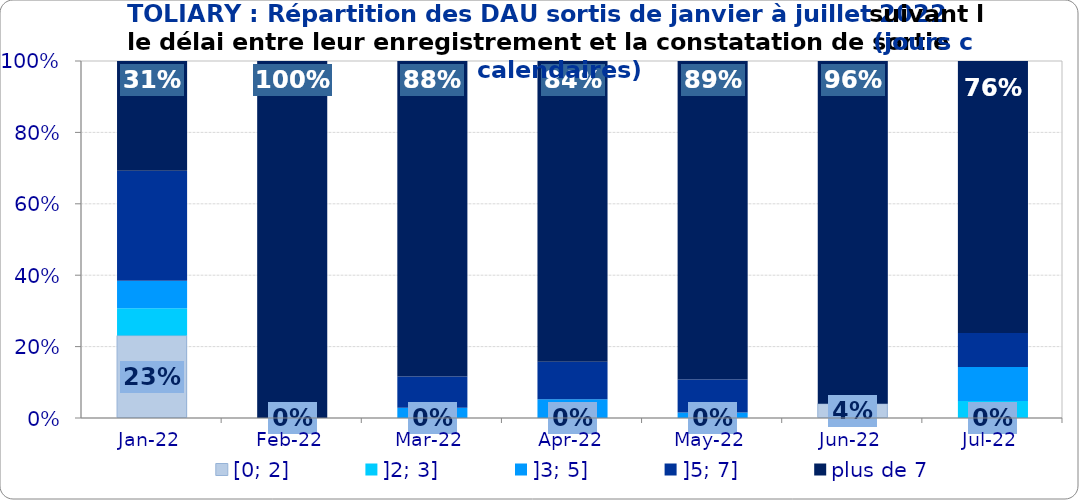
| Category | [0; 2] | ]2; 3] | ]3; 5] | ]5; 7] | plus de 7 |
|---|---|---|---|---|---|
| 2022-01-01 | 0.231 | 0.077 | 0.077 | 0.308 | 0.308 |
| 2022-02-01 | 0 | 0 | 0 | 0 | 1 |
| 2022-03-01 | 0 | 0 | 0.029 | 0.087 | 0.884 |
| 2022-04-01 | 0 | 0 | 0.053 | 0.105 | 0.842 |
| 2022-05-01 | 0 | 0 | 0.015 | 0.092 | 0.892 |
| 2022-06-01 | 0.04 | 0 | 0 | 0 | 0.96 |
| 2022-07-01 | 0 | 0.048 | 0.095 | 0.095 | 0.762 |